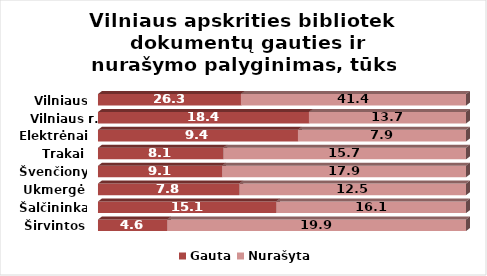
| Category | Gauta | Nurašyta |
|---|---|---|
| Širvintos | 4.6 | 19.9 |
| Šalčininkai | 15.1 | 16.1 |
| Ukmergė | 7.8 | 12.5 |
| Švenčionys | 9.1 | 17.9 |
| Trakai | 8.1 | 15.7 |
| Elektrėnai | 9.4 | 7.9 |
| Vilniaus r. | 18.4 | 13.7 |
| Vilniaus m. | 26.3 | 41.4 |